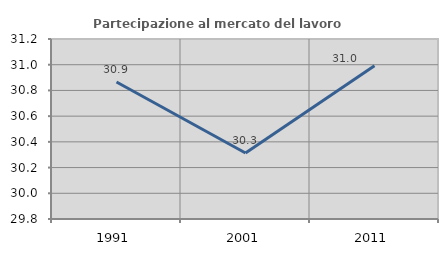
| Category | Partecipazione al mercato del lavoro  femminile |
|---|---|
| 1991.0 | 30.866 |
| 2001.0 | 30.313 |
| 2011.0 | 30.992 |